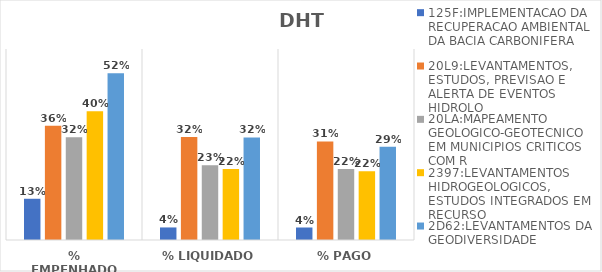
| Category | 125F:IMPLEMENTACAO DA RECUPERACAO AMBIENTAL DA BACIA CARBONIFERA | 20L9:LEVANTAMENTOS, ESTUDOS, PREVISAO E ALERTA DE EVENTOS HIDROLO | 20LA:MAPEAMENTO GEOLOGICO-GEOTECNICO EM MUNICIPIOS CRITICOS COM R | 2397:LEVANTAMENTOS HIDROGEOLOGICOS, ESTUDOS INTEGRADOS EM RECURSO | 2D62:LEVANTAMENTOS DA GEODIVERSIDADE |
|---|---|---|---|---|---|
| % EMPENHADO | 0.13 | 0.359 | 0.323 | 0.404 | 0.524 |
| % LIQUIDADO | 0.039 | 0.324 | 0.235 | 0.223 | 0.322 |
| % PAGO | 0.039 | 0.309 | 0.223 | 0.216 | 0.293 |